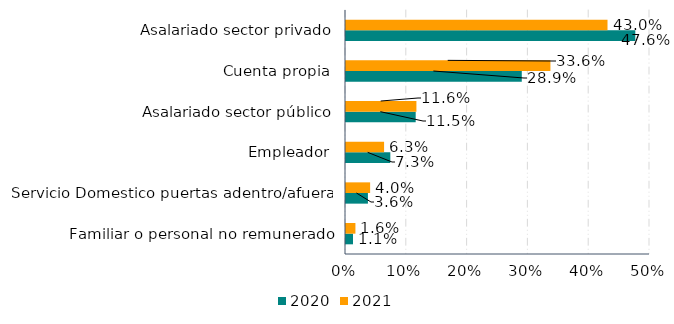
| Category | 2020 | 2021 |
|---|---|---|
| Familiar o personal no remunerado | 0.011 | 0.016 |
| Servicio Domestico puertas adentro/afuera | 0.036 | 0.04 |
| Empleador | 0.073 | 0.063 |
| Asalariado sector público | 0.115 | 0.116 |
| Cuenta propia | 0.289 | 0.336 |
| Asalariado sector privado | 0.476 | 0.43 |